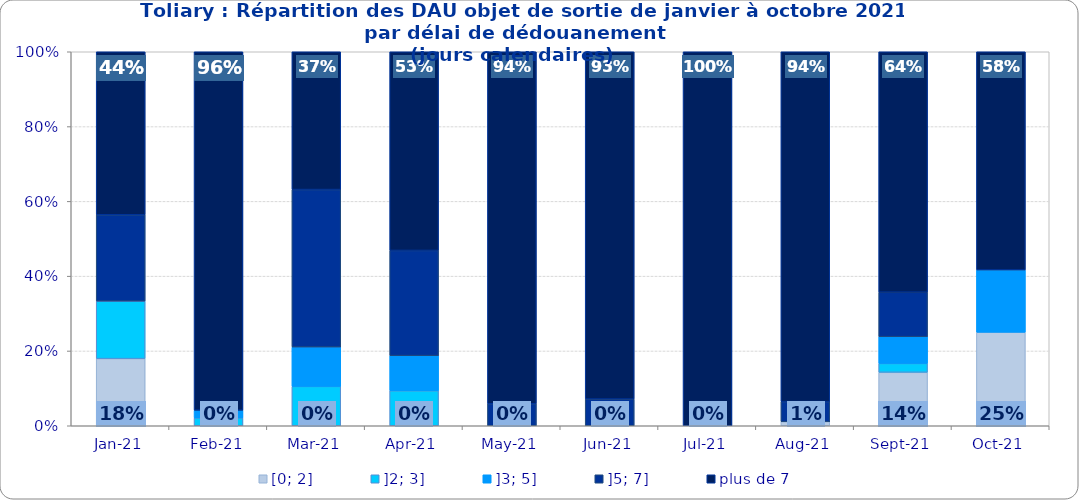
| Category | [0; 2] | ]2; 3] | ]3; 5] | ]5; 7] | plus de 7 |
|---|---|---|---|---|---|
| 2021-01-01 | 0.179 | 0.154 | 0 | 0.231 | 0.436 |
| 2021-02-01 | 0 | 0.021 | 0.021 | 0 | 0.958 |
| 2021-03-01 | 0 | 0.105 | 0.105 | 0.421 | 0.368 |
| 2021-04-01 | 0 | 0.094 | 0.094 | 0.281 | 0.531 |
| 2021-05-01 | 0 | 0 | 0 | 0.059 | 0.941 |
| 2021-06-01 | 0 | 0 | 0 | 0.071 | 0.929 |
| 2021-07-01 | 0 | 0 | 0 | 0 | 1 |
| 2021-08-01 | 0.011 | 0 | 0 | 0.054 | 0.935 |
| 2021-09-01 | 0.143 | 0.024 | 0.071 | 0.119 | 0.643 |
| 2021-10-01 | 0.25 | 0 | 0.167 | 0 | 0.583 |